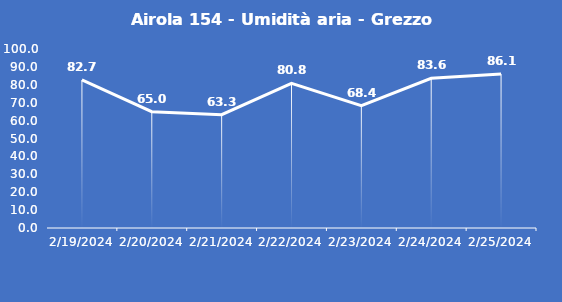
| Category | Airola 154 - Umidità aria - Grezzo (%) |
|---|---|
| 2/19/24 | 82.7 |
| 2/20/24 | 65 |
| 2/21/24 | 63.3 |
| 2/22/24 | 80.8 |
| 2/23/24 | 68.4 |
| 2/24/24 | 83.6 |
| 2/25/24 | 86.1 |